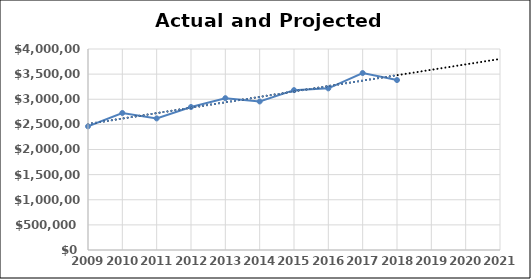
| Category | Series 0 |
|---|---|
| 2009.0 | 2460580 |
| 2010.0 | 2726614 |
| 2011.0 | 2618912 |
| 2012.0 | 2845692 |
| 2013.0 | 3021256 |
| 2014.0 | 2956123 |
| 2015.0 | 3181235 |
| 2016.0 | 3216548 |
| 2017.0 | 3521654 |
| 2018.0 | 3381955 |